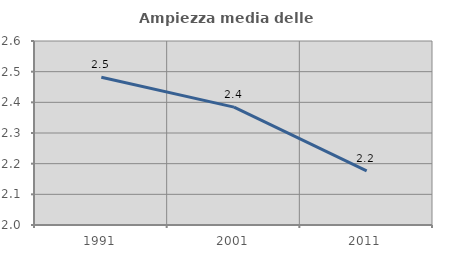
| Category | Ampiezza media delle famiglie |
|---|---|
| 1991.0 | 2.482 |
| 2001.0 | 2.384 |
| 2011.0 | 2.177 |